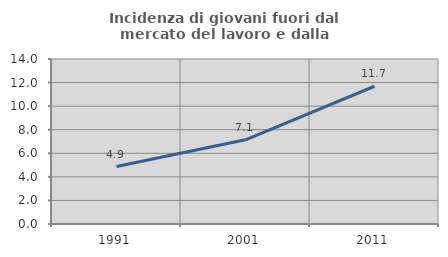
| Category | Incidenza di giovani fuori dal mercato del lavoro e dalla formazione  |
|---|---|
| 1991.0 | 4.878 |
| 2001.0 | 7.143 |
| 2011.0 | 11.688 |